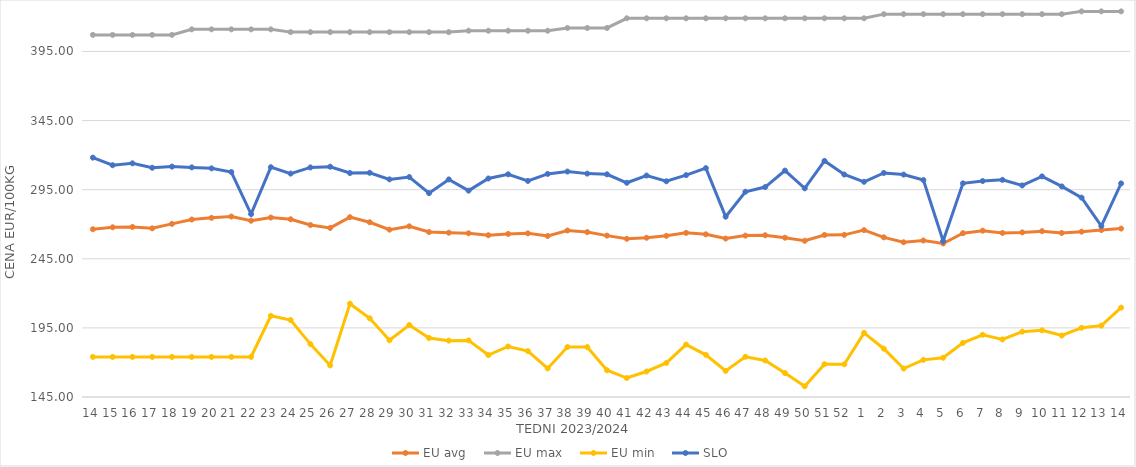
| Category | EU avg | EU max | EU min | SLO |
|---|---|---|---|---|
| 14.0 | 266.385 | 407 | 174 | 318.17 |
| 15.0 | 267.797 | 407 | 174 | 312.7 |
| 16.0 | 268.021 | 407 | 174 | 314.07 |
| 17.0 | 267.041 | 407 | 174 | 310.87 |
| 18.0 | 270.255 | 407 | 174 | 311.69 |
| 19.0 | 273.406 | 411 | 174 | 311.13 |
| 20.0 | 274.631 | 411 | 174 | 310.42 |
| 21.0 | 275.561 | 411 | 174 | 307.76 |
| 22.0 | 272.542 | 411 | 174 | 277.34 |
| 23.0 | 274.85 | 411 | 203.728 | 311.28 |
| 24.0 | 273.59 | 409 | 200.686 | 306.64 |
| 25.0 | 269.439 | 409 | 183.275 | 311.1 |
| 26.0 | 267.345 | 409 | 167.858 | 311.62 |
| 27.0 | 275.123 | 409 | 212.506 | 307.04 |
| 28.0 | 271.42 | 409 | 201.945 | 307.23 |
| 29.0 | 266.08 | 409 | 186.018 | 302.45 |
| 30.0 | 268.49 | 409 | 197.093 | 304.14 |
| 31.0 | 264.334 | 409 | 187.684 | 292.49 |
| 32.0 | 263.844 | 409 | 185.774 | 302.41 |
| 33.0 | 263.441 | 410 | 185.951 | 294.3 |
| 34.0 | 262.028 | 410 | 175.332 | 303.1 |
| 35.0 | 262.997 | 410 | 181.543 | 306.13 |
| 36.0 | 263.389 | 410 | 178.207 | 301.32 |
| 37.0 | 261.486 | 410 | 165.697 | 306.4 |
| 38.0 | 265.47 | 412 | 181.159 | 308.12 |
| 39.0 | 264.316 | 412 | 181.124 | 306.62 |
| 40.0 | 261.774 | 412 | 164.37 | 306.1 |
| 41.0 | 259.456 | 419 | 158.728 | 300 |
| 42.0 | 260.21 | 419 | 163.464 | 305.24 |
| 43.0 | 261.605 | 419 | 169.66 | 301.07 |
| 44.0 | 263.758 | 419 | 182.925 | 305.52 |
| 45.0 | 262.714 | 419 | 175.524 | 310.58 |
| 46.0 | 259.625 | 419 | 163.882 | 275.46 |
| 47.0 | 261.772 | 419 | 174.136 | 293.51 |
| 48.0 | 262.018 | 419 | 171.4 | 296.9 |
| 49.0 | 260.246 | 419 | 162.336 | 308.8 |
| 50.0 | 258.042 | 419 | 152.762 | 295.97 |
| 51.0 | 262.231 | 419 | 168.739 | 315.82 |
| 52.0 | 262.325 | 419 | 168.659 | 305.97 |
| 1.0 | 265.728 | 419 | 191.406 | 300.71 |
| 2.0 | 260.513 | 422 | 179.926 | 307.09 |
| 3.0 | 256.954 | 422 | 165.575 | 305.92 |
| 4.0 | 258.235 | 422 | 171.865 | 301.97 |
| 5.0 | 256.09 | 422 | 173.378 | 257.83 |
| 6.0 | 263.546 | 422 | 184.141 | 299.57 |
| 7.0 | 265.335 | 422 | 190.004 | 301.25 |
| 8.0 | 263.713 | 422 | 186.634 | 302.13 |
| 9.0 | 264.079 | 422 | 192.243 | 298.07 |
| 10.0 | 264.975 | 422 | 193.276 | 304.62 |
| 11.0 | 263.67 | 422 | 189.495 | 297.35 |
| 12.0 | 264.614 | 424 | 195.103 | 289.25 |
| 13.0 | 265.758 | 424 | 196.623 | 268.71 |
| 14.0 | 266.846 | 424 | 209.634 | 299.54 |